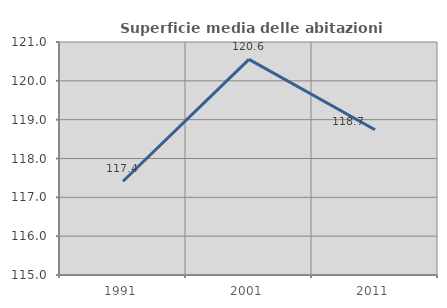
| Category | Superficie media delle abitazioni occupate |
|---|---|
| 1991.0 | 117.414 |
| 2001.0 | 120.553 |
| 2011.0 | 118.742 |